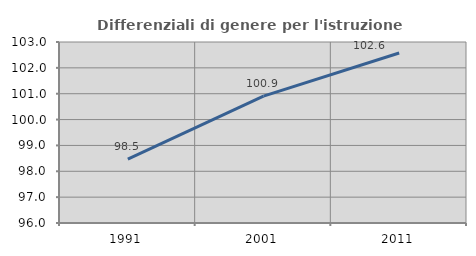
| Category | Differenziali di genere per l'istruzione superiore |
|---|---|
| 1991.0 | 98.469 |
| 2001.0 | 100.904 |
| 2011.0 | 102.577 |